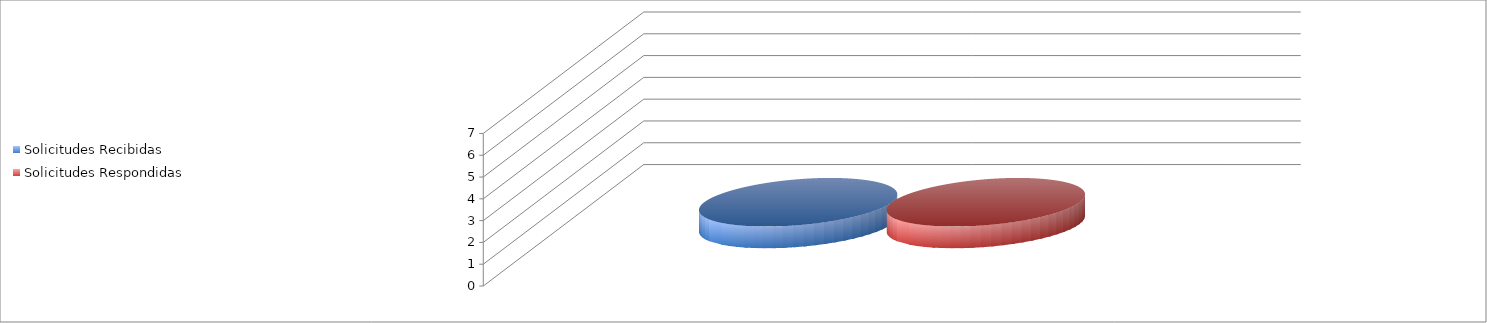
| Category | Solicitudes Recibidas | Solicitudes Respondidas |
|---|---|---|
| 1.0 | 1 | 1 |